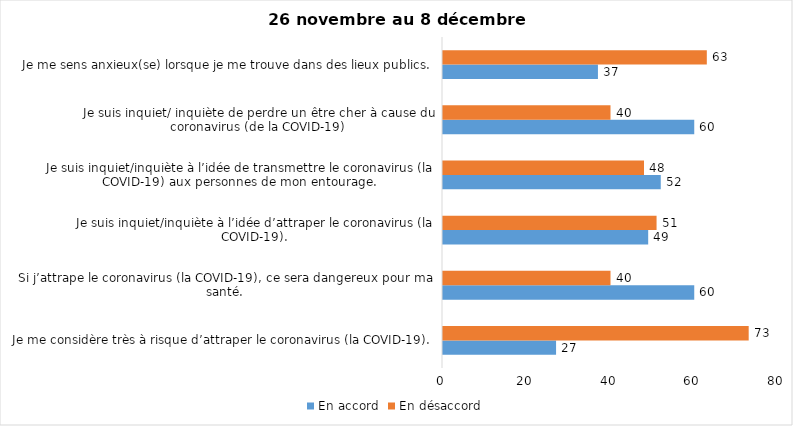
| Category | En accord | En désaccord |
|---|---|---|
| Je me considère très à risque d’attraper le coronavirus (la COVID-19). | 27 | 73 |
| Si j’attrape le coronavirus (la COVID-19), ce sera dangereux pour ma santé. | 60 | 40 |
| Je suis inquiet/inquiète à l’idée d’attraper le coronavirus (la COVID-19). | 49 | 51 |
| Je suis inquiet/inquiète à l’idée de transmettre le coronavirus (la COVID-19) aux personnes de mon entourage. | 52 | 48 |
| Je suis inquiet/ inquiète de perdre un être cher à cause du coronavirus (de la COVID-19) | 60 | 40 |
| Je me sens anxieux(se) lorsque je me trouve dans des lieux publics. | 37 | 63 |